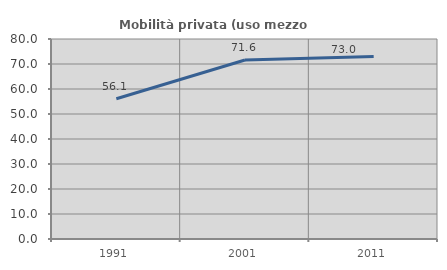
| Category | Mobilità privata (uso mezzo privato) |
|---|---|
| 1991.0 | 56.098 |
| 2001.0 | 71.585 |
| 2011.0 | 72.979 |